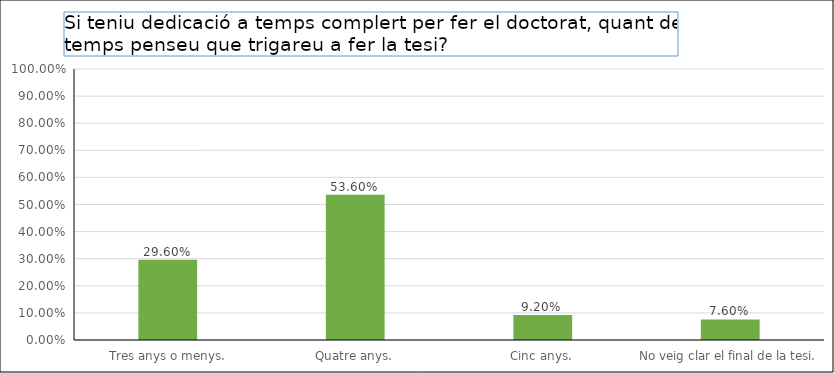
| Category | Series 0 |
|---|---|
|  Tres anys o menys. | 0.296 |
| Quatre anys. | 0.536 |
| Cinc anys. | 0.092 |
| No veig clar el final de la tesi. | 0.076 |